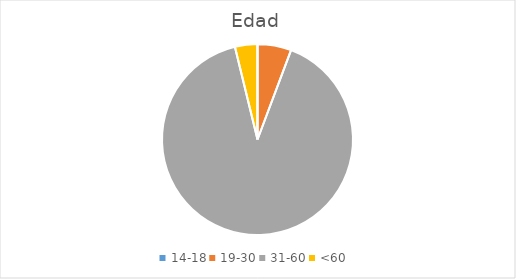
| Category | Series 0 |
|---|---|
| 14-18 | 0 |
| 19-30 | 6 |
| 31-60 | 95 |
| <60 | 4 |